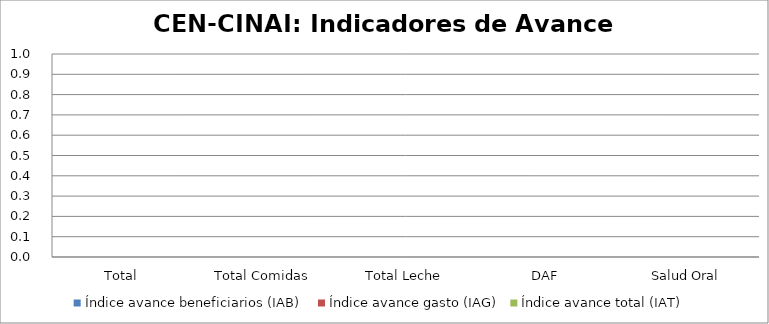
| Category | Índice avance beneficiarios (IAB)  | Índice avance gasto (IAG) | Índice avance total (IAT)  |
|---|---|---|---|
| Total | 0 | 0 | 0 |
| Total Comidas | 0 | 0 | 0 |
| Total Leche | 0 | 0 | 0 |
| DAF | 0 | 0 | 0 |
| Salud Oral | 0 | 0 | 0 |